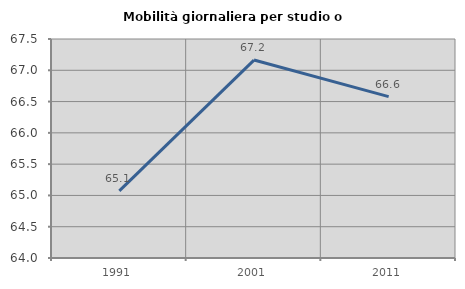
| Category | Mobilità giornaliera per studio o lavoro |
|---|---|
| 1991.0 | 65.073 |
| 2001.0 | 67.163 |
| 2011.0 | 66.579 |